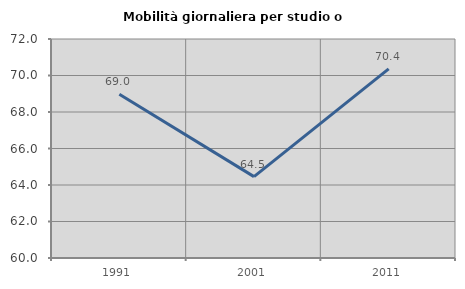
| Category | Mobilità giornaliera per studio o lavoro |
|---|---|
| 1991.0 | 68.977 |
| 2001.0 | 64.459 |
| 2011.0 | 70.361 |